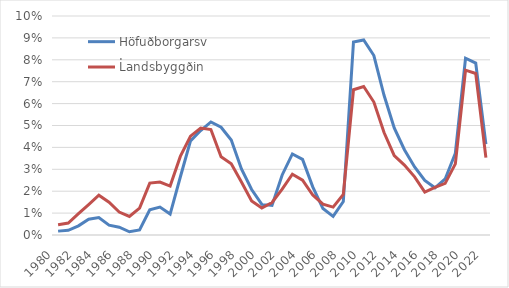
| Category | Höfuðborgarsv. | Landsbyggðin |
|---|---|---|
| 1980.0 | 0.177 | 0.473 |
| 1981.0 | 0.215 | 0.546 |
| 1982.0 | 0.419 | 0.976 |
| 1983.0 | 0.724 | 1.389 |
| 1984.0 | 0.797 | 1.818 |
| 1985.0 | 0.451 | 1.499 |
| 1986.0 | 0.356 | 1.048 |
| 1987.0 | 0.148 | 0.846 |
| 1988.0 | 0.231 | 1.231 |
| 1989.0 | 1.148 | 2.37 |
| 1990.0 | 1.274 | 2.418 |
| 1991.0 | 0.956 | 2.232 |
| 1992.0 | 2.649 | 3.587 |
| 1993.0 | 4.297 | 4.513 |
| 1994.0 | 4.769 | 4.887 |
| 1995.0 | 5.162 | 4.816 |
| 1996.0 | 4.92 | 3.575 |
| 1997.0 | 4.334 | 3.254 |
| 1998.0 | 3.014 | 2.416 |
| 1999.0 | 2.078 | 1.559 |
| 2000.0 | 1.397 | 1.229 |
| 2001.0 | 1.349 | 1.484 |
| 2002.0 | 2.742 | 2.093 |
| 2003.0 | 3.701 | 2.774 |
| 2004.0 | 3.451 | 2.501 |
| 2005.0 | 2.197 | 1.827 |
| 2006.0 | 1.209 | 1.411 |
| 2007.0 | 0.852 | 1.275 |
| 2008.0 | 1.525 | 1.857 |
| 2009.0 | 8.814 | 6.633 |
| 2010.0 | 8.903 | 6.782 |
| 2011.0 | 8.195 | 6.071 |
| 2012.0 | 6.379 | 4.678 |
| 2013.0 | 4.889 | 3.621 |
| 2014.0 | 3.893 | 3.192 |
| 2015.0 | 3.106 | 2.656 |
| 2016.0 | 2.49 | 1.96 |
| 2017.0 | 2.155 | 2.179 |
| 2018.0 | 2.558 | 2.357 |
| 2019.0 | 3.734 | 3.246 |
| 2020.0 | 8.071 | 7.527 |
| 2021.0 | 7.849 | 7.376 |
| 2022.0 | 4.149 | 3.536 |